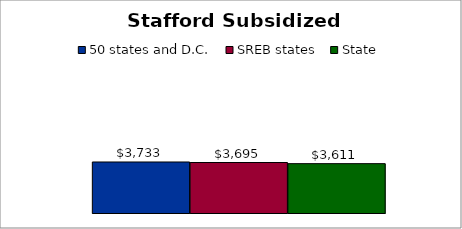
| Category | 50 states and D.C. | SREB states | State |
|---|---|---|---|
| 0 | 3732.608 | 3694.892 | 3610.859 |